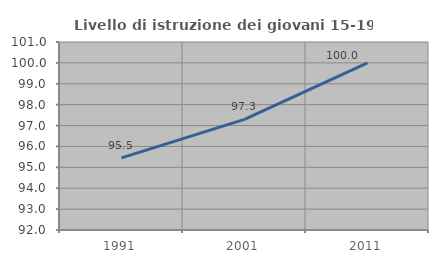
| Category | Livello di istruzione dei giovani 15-19 anni |
|---|---|
| 1991.0 | 95.455 |
| 2001.0 | 97.297 |
| 2011.0 | 100 |